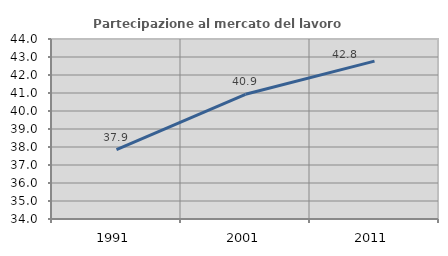
| Category | Partecipazione al mercato del lavoro  femminile |
|---|---|
| 1991.0 | 37.853 |
| 2001.0 | 40.929 |
| 2011.0 | 42.77 |